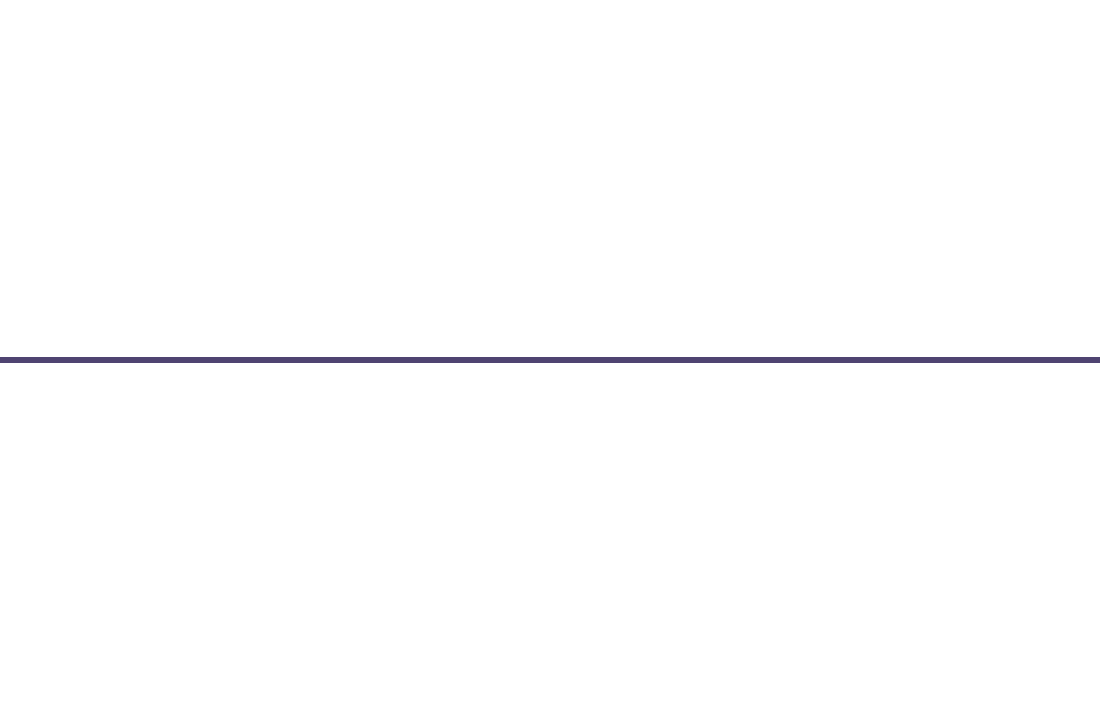
| Category | Placering |
|---|---|
| 0 | 1 |
| 1 | -2 |
| 2 | 1 |
| 3 | -1 |
| 4 | -0.5 |
| 5 | 2 |
| 6 | 0.5 |
| 7 | -1 |
| 8 | 0.5 |
| 9 | -2 |